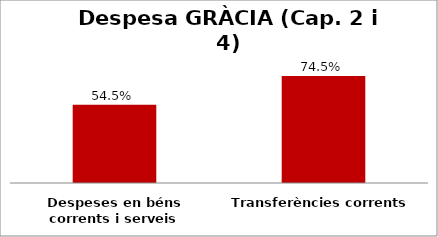
| Category | Series 0 |
|---|---|
| Despeses en béns corrents i serveis | 0.545 |
| Transferències corrents | 0.745 |